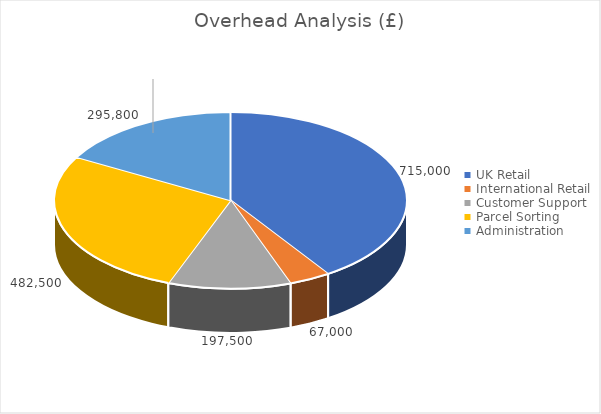
| Category | Series 0 |
|---|---|
| UK Retail | 715000 |
| International Retail | 67000 |
| Customer Support | 197500 |
| Parcel Sorting | 482500 |
| Administration | 295800 |